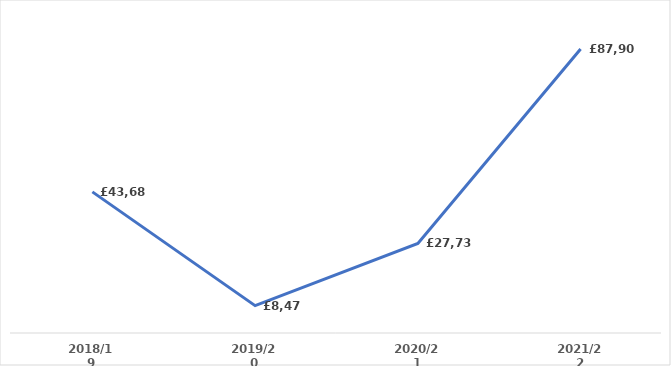
| Category | Series 0 |
|---|---|
| 2018/19 | 43686.47 |
| 2019/20 | 8477.784 |
| 2020/21 | 27735.502 |
| 2021/22 | 87904.46 |